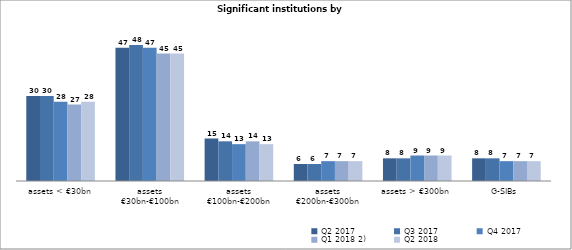
| Category | Q2 2017 | Q3 2017 | Q4 2017 | Q1 2018 2) | Q2 2018 |
|---|---|---|---|---|---|
| assets < €30bn | 30 | 30 | 28 | 27 | 28 |
| assets
€30bn-€100bn | 47 | 48 | 47 | 45 | 45 |
| assets
€100bn-€200bn | 15 | 14 | 13 | 14 | 13 |
| assets
€200bn-€300bn | 6 | 6 | 7 | 7 | 7 |
| assets > €300bn | 8 | 8 | 9 | 9 | 9 |
| G-SIBs | 8 | 8 | 7 | 7 | 7 |